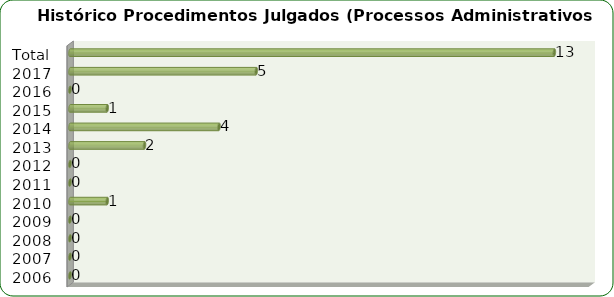
| Category | Total de Processos Administrativos Disciplinares |
|---|---|
| 2006 | 0 |
| 2007 | 0 |
| 2008 | 0 |
| 2009 | 0 |
| 2010 | 1 |
| 2011 | 0 |
| 2012 | 0 |
| 2013 | 2 |
| 2014 | 4 |
| 2015 | 1 |
| 2016 | 0 |
| 2017 | 5 |
| Total | 13 |